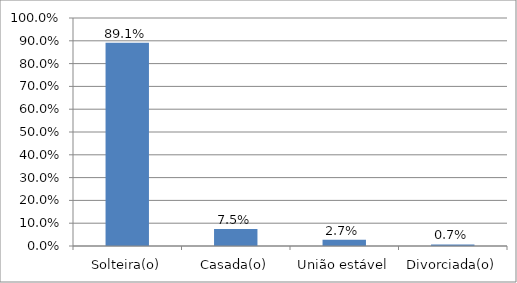
| Category | Series 0 |
|---|---|
| Solteira(o) | 0.891 |
| Casada(o) | 0.075 |
| União estável | 0.027 |
| Divorciada(o) | 0.007 |